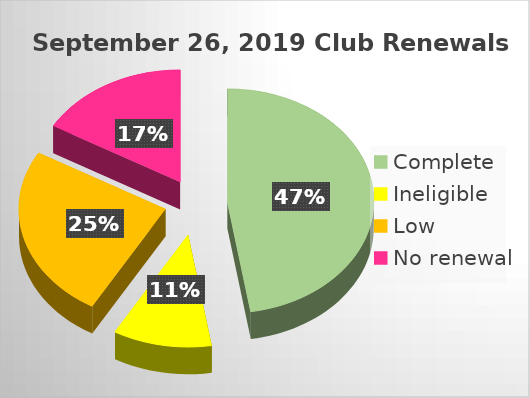
| Category | Series 0 |
|---|---|
| Complete | 0.474 |
| Ineligible | 0.109 |
| Low | 0.25 |
| No renewal | 0.167 |